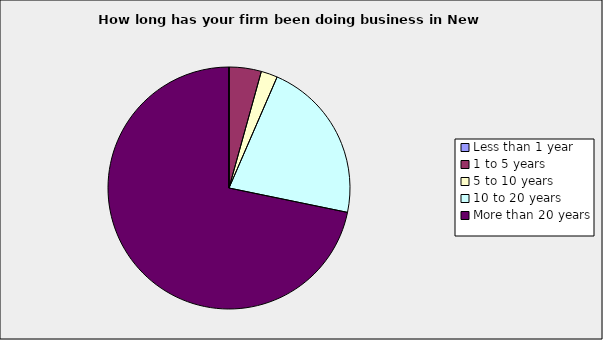
| Category | Series 0 |
|---|---|
| Less than 1 year | 0 |
| 1 to 5 years | 0.043 |
| 5 to 10 years | 0.022 |
| 10 to 20 years | 0.217 |
| More than 20 years | 0.717 |